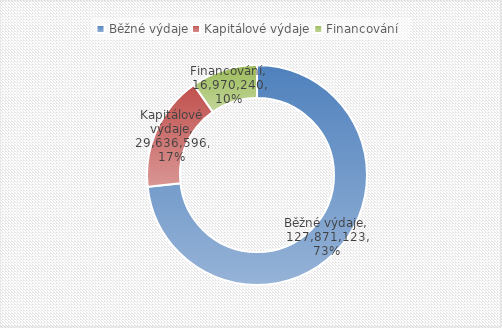
| Category | Series 0 |
|---|---|
| Běžné výdaje | 127871123.278 |
| Kapitálové výdaje | 29636596 |
| Financování | 16970240.182 |